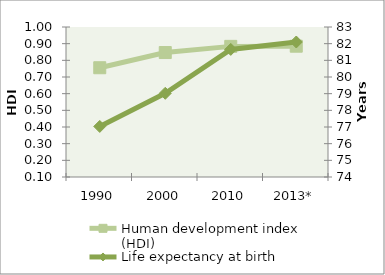
| Category | Human development index (HDI) |
|---|---|
| 1990 | 0.756 |
| 2000 | 0.847 |
| 2010 | 0.884 |
| 2013* | 0.885 |